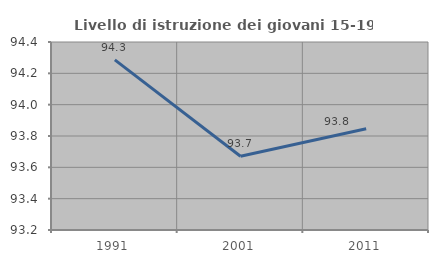
| Category | Livello di istruzione dei giovani 15-19 anni |
|---|---|
| 1991.0 | 94.286 |
| 2001.0 | 93.671 |
| 2011.0 | 93.846 |